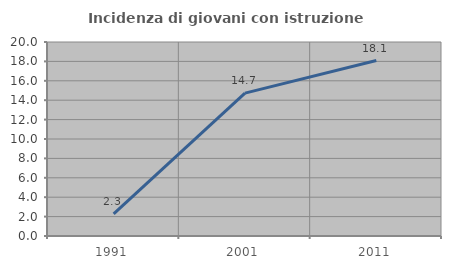
| Category | Incidenza di giovani con istruzione universitaria |
|---|---|
| 1991.0 | 2.273 |
| 2001.0 | 14.732 |
| 2011.0 | 18.09 |